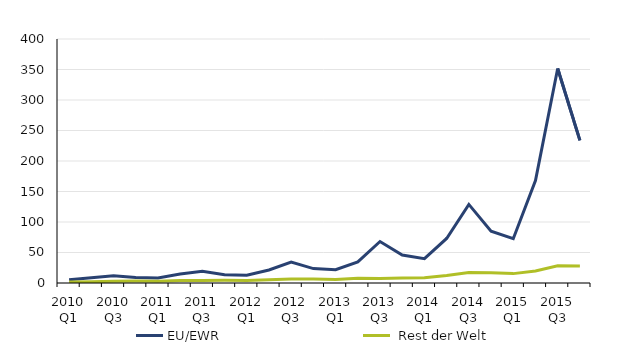
| Category | EU/EWR |  Rest der Welt |
|---|---|---|
| 2010 Q1 | 5.277 | 1.501 |
| 2010 Q2 | 8.7 | 2.034 |
| 2010 Q3 | 12.005 | 2.825 |
| 2010 Q4 | 8.857 | 3.207 |
| 2011 Q1 | 8.354 | 3.02 |
| 2011 Q2 | 14.612 | 3.918 |
| 2011 Q3 | 19.162 | 3.895 |
| 2011 Q4 | 13.635 | 4.366 |
| 2012 Q1 | 12.588 | 4.086 |
| 2012 Q2 | 21.3 | 5.134 |
| 2012 Q3 | 34.327 | 6.403 |
| 2012 Q4 | 23.663 | 6.488 |
| 2013 Q1 | 21.88 | 5.777 |
| 2013 Q2 | 34.532 | 7.657 |
| 2013 Q3 | 68.012 | 7.409 |
| 2013 Q4 | 45.829 | 8.147 |
| 2014 Q1 | 39.851 | 8.548 |
| 2014 Q2 | 73.005 | 12.315 |
| 2014 Q3 | 128.849 | 17.039 |
| 2014 Q4 | 85.07 | 16.834 |
| 2015 Q1 | 72.621 | 15.382 |
| 2015 Q2 | 168.039 | 19.807 |
| 2015 Q3 | 351.689 | 28.28 |
| 2015 Q4 | 233.804 | 27.83 |